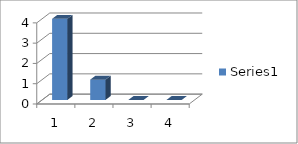
| Category | Series 0 |
|---|---|
| 0 | 4 |
| 1 | 1 |
| 2 | 0 |
| 3 | 0 |